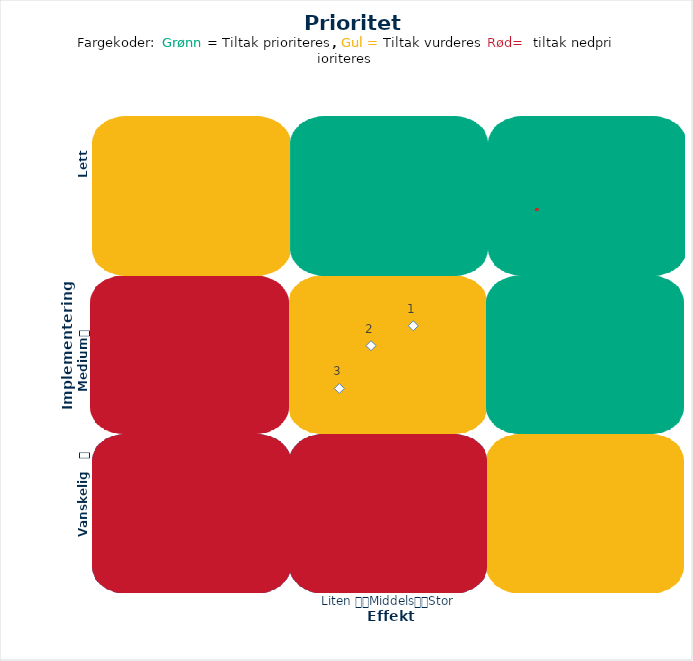
| Category | Series 0 |
|---|---|
| 2.129996660851062 | 2.18 |
| 1.916979859921096 | 2.055 |
| 1.757106944220647 | 1.787 |
| 0.0 | 0 |
| 0.0 | 0 |
| 0.0 | 0 |
| 0.0 | 0 |
| 0.0 | 0 |
| 0.0 | 0 |
| 0.0 | 0 |
| 0.0 | 0 |
| 0.0 | 0 |
| 0.0 | 0 |
| 0.0 | 0 |
| 0.0 | 0 |
| 0.0 | 0 |
| 0.0 | 0 |
| 0.0 | 0 |
| 0.0 | 0 |
| 0.0 | 0 |
| 0.0 | 0 |
| 0.0 | 0 |
| 0.0 | 0 |
| 0.0 | 0 |